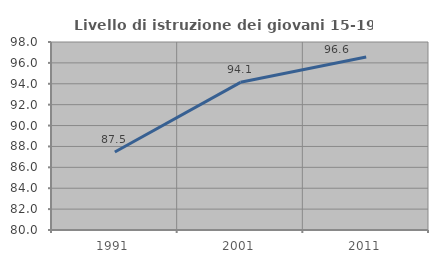
| Category | Livello di istruzione dei giovani 15-19 anni |
|---|---|
| 1991.0 | 87.469 |
| 2001.0 | 94.138 |
| 2011.0 | 96.565 |